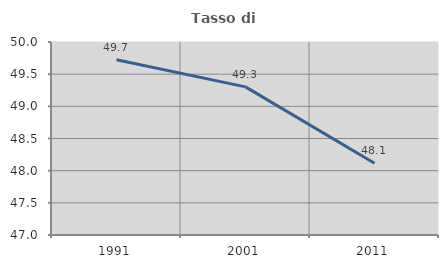
| Category | Tasso di occupazione   |
|---|---|
| 1991.0 | 49.725 |
| 2001.0 | 49.302 |
| 2011.0 | 48.115 |